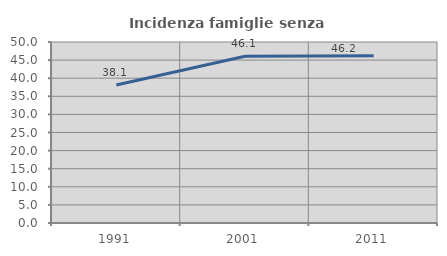
| Category | Incidenza famiglie senza nuclei |
|---|---|
| 1991.0 | 38.132 |
| 2001.0 | 46.052 |
| 2011.0 | 46.185 |